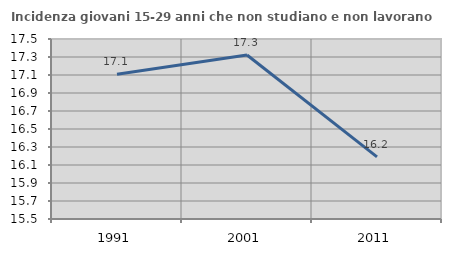
| Category | Incidenza giovani 15-29 anni che non studiano e non lavorano  |
|---|---|
| 1991.0 | 17.108 |
| 2001.0 | 17.323 |
| 2011.0 | 16.19 |